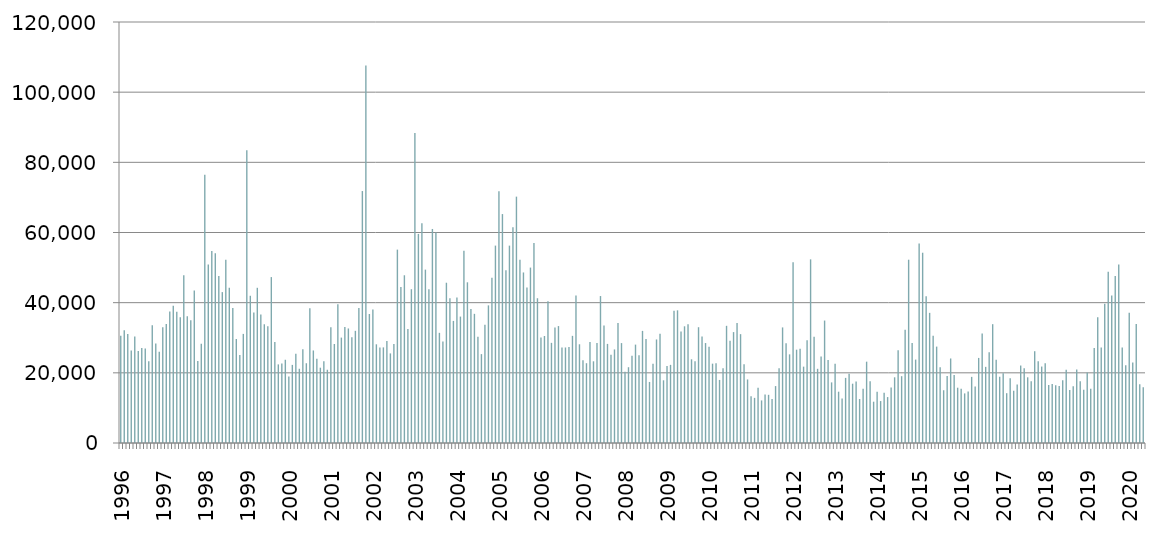
| Category | Series 0 |
|---|---|
| 1996.0 | 30565 |
| nan | 32123 |
| nan | 31044 |
| nan | 26401 |
| nan | 30370 |
| nan | 26254 |
| nan | 27073 |
| nan | 26911 |
| nan | 23273 |
| nan | 33595 |
| nan | 28374 |
| nan | 26036 |
| 1997.0 | 32963 |
| nan | 33890 |
| nan | 37509 |
| nan | 39128 |
| nan | 37399 |
| nan | 35850 |
| nan | 47806 |
| nan | 36117 |
| nan | 35023 |
| nan | 43488 |
| nan | 23397 |
| nan | 28305 |
| 1998.0 | 76429 |
| nan | 50851 |
| nan | 54713 |
| nan | 54112 |
| nan | 47617 |
| nan | 43007 |
| nan | 52250 |
| nan | 44252 |
| nan | 38498 |
| nan | 29638 |
| nan | 25062 |
| nan | 31098 |
| 1999.0 | 83423 |
| nan | 41965 |
| nan | 37191 |
| nan | 44236 |
| nan | 36632 |
| nan | 33845 |
| nan | 33248 |
| nan | 47294 |
| nan | 28815 |
| nan | 22406 |
| nan | 22665 |
| nan | 23726 |
| 2000.0 | 18950 |
| nan | 22265 |
| nan | 25419 |
| nan | 21159 |
| nan | 26713 |
| nan | 22736 |
| nan | 38395 |
| nan | 26379 |
| nan | 24035 |
| nan | 21466 |
| nan | 23271 |
| nan | 20879 |
| 2001.0 | 32965 |
| nan | 28222 |
| nan | 39557 |
| nan | 30046 |
| nan | 33063 |
| nan | 32645 |
| nan | 30113 |
| nan | 31974 |
| nan | 38459 |
| nan | 71817 |
| nan | 107589 |
| nan | 36768 |
| 2002.0 | 38060 |
| nan | 28131 |
| nan | 27242 |
| nan | 27255 |
| nan | 29074 |
| nan | 25539 |
| nan | 28215 |
| nan | 55117 |
| nan | 44435 |
| nan | 47808 |
| nan | 32529 |
| nan | 43837 |
| 2003.0 | 88327 |
| nan | 59597 |
| nan | 62620 |
| nan | 49416 |
| nan | 43798 |
| nan | 61007 |
| nan | 60030 |
| nan | 31400 |
| nan | 28943 |
| nan | 45683 |
| nan | 41241 |
| nan | 34803 |
| 2004.0 | 41446 |
| nan | 36034 |
| nan | 54779 |
| nan | 45804 |
| nan | 38217 |
| nan | 36816 |
| nan | 30279 |
| nan | 25336 |
| nan | 33712 |
| nan | 39233 |
| nan | 47110 |
| nan | 56266 |
| 2005.0 | 71750 |
| nan | 65255 |
| nan | 49275 |
| nan | 56256 |
| nan | 61526 |
| nan | 70220 |
| nan | 52226 |
| nan | 48610 |
| nan | 44307 |
| nan | 49999 |
| nan | 57010 |
| nan | 41262 |
| 2006.0 | 30057 |
| nan | 30492 |
| nan | 40434 |
| nan | 28545 |
| nan | 32934 |
| nan | 33331 |
| nan | 27232 |
| nan | 27227 |
| nan | 27362 |
| nan | 30541 |
| nan | 42045 |
| nan | 28139 |
| 2007.0 | 23612 |
| nan | 22747 |
| nan | 28800 |
| nan | 23287 |
| nan | 28534 |
| nan | 41888 |
| nan | 33468 |
| nan | 28249 |
| nan | 25173 |
| nan | 26672 |
| nan | 34222 |
| nan | 28477 |
| 2008.0 | 20317 |
| nan | 21603 |
| nan | 24900 |
| nan | 28044 |
| nan | 25045 |
| nan | 31958 |
| nan | 29617 |
| nan | 17400 |
| nan | 22606 |
| nan | 29515 |
| nan | 31141 |
| nan | 17871 |
| 2009.0 | 21922 |
| nan | 22273 |
| nan | 37691 |
| nan | 37814 |
| nan | 31759 |
| nan | 33266 |
| nan | 33847 |
| nan | 23861 |
| nan | 23337 |
| nan | 33006 |
| nan | 30362 |
| nan | 28492 |
| 2010.0 | 27450 |
| nan | 22616 |
| nan | 22731 |
| nan | 17976 |
| nan | 21322 |
| nan | 33400 |
| nan | 29135 |
| nan | 31611 |
| nan | 34182 |
| nan | 31026 |
| nan | 22439 |
| nan | 18115 |
| 2011.0 | 13316 |
| nan | 12864 |
| nan | 15754 |
| nan | 12139 |
| nan | 13789 |
| nan | 13734 |
| nan | 12532 |
| nan | 16226 |
| nan | 21335 |
| nan | 32945 |
| nan | 28411 |
| nan | 25267 |
| 2012.0 | 51510 |
| nan | 26596 |
| nan | 26832 |
| nan | 21765 |
| nan | 29303 |
| nan | 52347 |
| nan | 30268 |
| nan | 21147 |
| nan | 24668 |
| nan | 34903 |
| nan | 23658 |
| nan | 17274 |
| 2013.0 | 22563 |
| nan | 14625 |
| nan | 12699 |
| nan | 18561 |
| nan | 19723 |
| nan | 16907 |
| nan | 17520 |
| nan | 12540 |
| nan | 15437 |
| nan | 23184 |
| nan | 17588 |
| nan | 11776 |
| 2014.0 | 14586 |
| nan | 11955 |
| nan | 14313 |
| nan | 13092 |
| nan | 15802 |
| nan | 18723 |
| nan | 26437 |
| nan | 19044 |
| nan | 32284 |
| nan | 52247 |
| nan | 28493 |
| nan | 23777 |
| 2015.0 | 56844 |
| nan | 54236 |
| nan | 41842 |
| nan | 37095 |
| nan | 30576 |
| nan | 27477 |
| nan | 21618 |
| nan | 15038 |
| nan | 19111 |
| nan | 24093 |
| nan | 19410 |
| nan | 15763 |
| 2016.0 | 15437 |
| nan | 14139 |
| nan | 14651 |
| nan | 18849 |
| nan | 16093 |
| nan | 24250 |
| nan | 31240 |
| nan | 21702 |
| nan | 25896 |
| nan | 33869 |
| nan | 23745 |
| nan | 18884 |
| 2017.0 | 19855 |
| nan | 14198 |
| nan | 18466 |
| nan | 14903 |
| nan | 16658 |
| nan | 22085 |
| nan | 21288 |
| nan | 18723 |
| nan | 17630 |
| nan | 26163 |
| nan | 23289 |
| nan | 21791 |
| 2018.0 | 22760 |
| nan | 16515 |
| nan | 16828 |
| nan | 16495 |
| nan | 16238 |
| nan | 17890 |
| nan | 20891 |
| nan | 15083 |
| nan | 16174 |
| nan | 20928 |
| nan | 17597 |
| nan | 15201 |
| 2019.0 | 20124 |
| nan | 15478 |
| nan | 27086 |
| nan | 35849 |
| nan | 27253 |
| nan | 39668 |
| nan | 48828 |
| nan | 42071 |
| nan | 47584 |
| nan | 50870 |
| nan | 27234 |
| nan | 22192 |
| 2020.0 | 37109 |
| nan | 22975 |
| nan | 33939 |
| nan | 16770 |
| nan | 15910 |